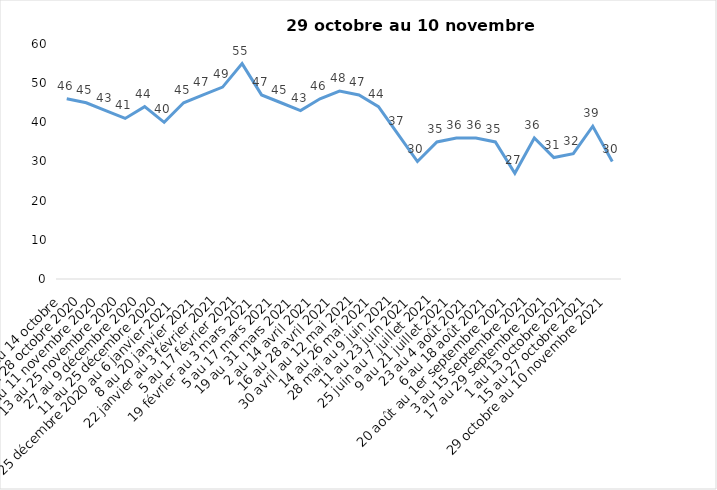
| Category | Toujours aux trois mesures |
|---|---|
| 2 au 14 octobre  | 46 |
| 16 au 28 octobre 2020 | 45 |
| 30 octobre au 11 novembre 2020 | 43 |
| 13 au 25 novembre 2020 | 41 |
| 27 au 9 décembre 2020 | 44 |
| 11 au 25 décembre 2020 | 40 |
| 25 décembre 2020 au 6 janvier 2021 | 45 |
| 8 au 20 janvier 2021 | 47 |
| 22 janvier au 3 février 2021 | 49 |
| 5 au 17 février 2021 | 55 |
| 19 février au 3 mars 2021 | 47 |
| 5 au 17 mars 2021 | 45 |
| 19 au 31 mars 2021 | 43 |
| 2 au 14 avril 2021 | 46 |
| 16 au 28 avril 2021 | 48 |
| 30 avril au 12 mai 2021 | 47 |
| 14 au 26 mai 2021 | 44 |
| 28 mai au 9 juin 2021 | 37 |
| 11 au 23 juin 2021 | 30 |
| 25 juin au 7 juillet 2021 | 35 |
| 9 au 21 juillet 2021 | 36 |
| 23 au 4 août 2021 | 36 |
| 6 au 18 août 2021 | 35 |
| 20 août au 1er septembre 2021 | 27 |
| 3 au 15 septembre 2021 | 36 |
| 17 au 29 septembre 2021 | 31 |
| 1 au 13 octobre 2021 | 32 |
| 15 au 27 octobre 2021 | 39 |
| 29 octobre au 10 novembre 2021 | 30 |